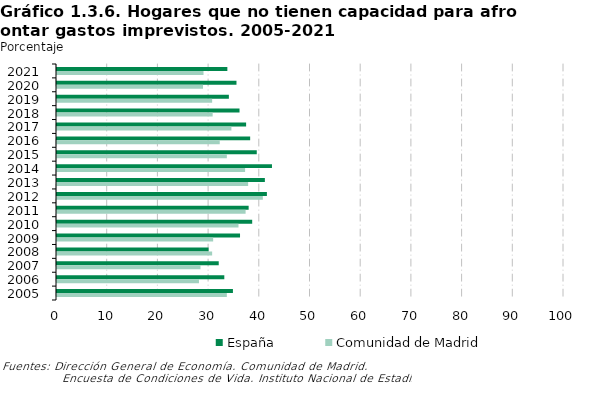
| Category | España | Comunidad de Madrid |
|---|---|---|
| 2021 | 33.6 | 28.9 |
| 2020 | 35.4 | 28.8 |
| 2019 | 33.9 | 30.6 |
| 2018 | 36 | 30.7 |
| 2017 | 37.3 | 34.4 |
| 2016 | 38.1 | 32.1 |
| 2015 | 39.4 | 33.5 |
| 2014 | 42.4 | 37.1 |
| 2013 | 41 | 37.7 |
| 2012 | 41.4 | 40.6 |
| 2011 | 37.8 | 37.2 |
| 2010 | 38.5 | 35.8 |
| 2009 | 36.1 | 30.8 |
| 2008 | 29.9 | 30.6 |
| 2007 | 31.9 | 28.3 |
| 2006 | 33 | 28 |
| 2005 | 34.7 | 33.5 |